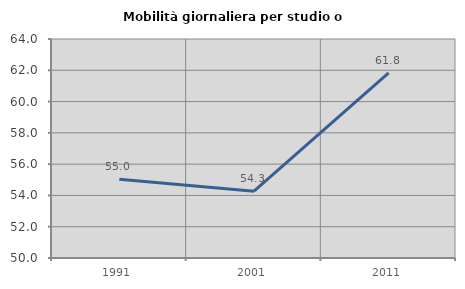
| Category | Mobilità giornaliera per studio o lavoro |
|---|---|
| 1991.0 | 55.04 |
| 2001.0 | 54.268 |
| 2011.0 | 61.835 |